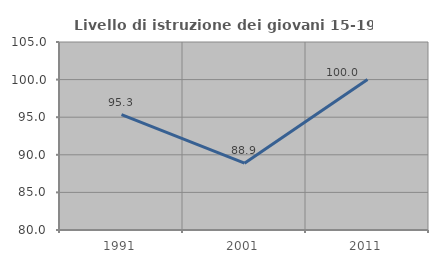
| Category | Livello di istruzione dei giovani 15-19 anni |
|---|---|
| 1991.0 | 95.349 |
| 2001.0 | 88.889 |
| 2011.0 | 100 |